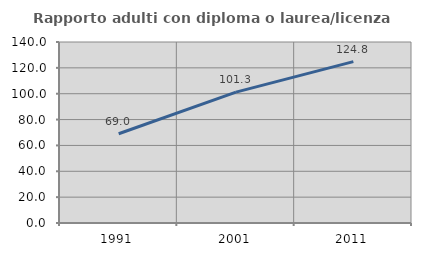
| Category | Rapporto adulti con diploma o laurea/licenza media  |
|---|---|
| 1991.0 | 69.029 |
| 2001.0 | 101.261 |
| 2011.0 | 124.833 |